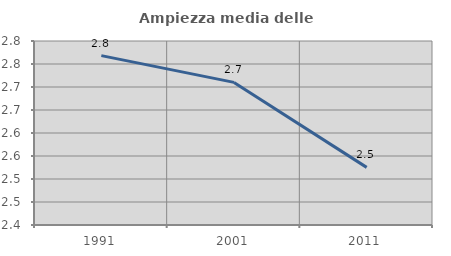
| Category | Ampiezza media delle famiglie |
|---|---|
| 1991.0 | 2.768 |
| 2001.0 | 2.71 |
| 2011.0 | 2.525 |